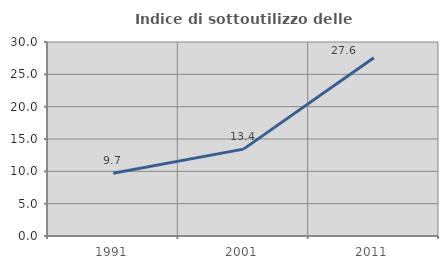
| Category | Indice di sottoutilizzo delle abitazioni  |
|---|---|
| 1991.0 | 9.689 |
| 2001.0 | 13.436 |
| 2011.0 | 27.558 |